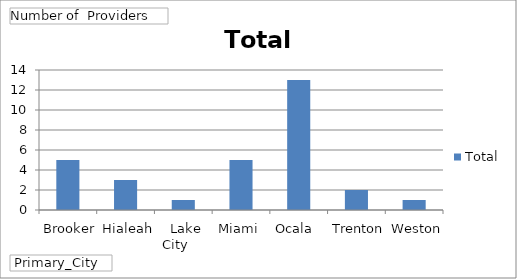
| Category | Total |
|---|---|
|  Brooker       | 5 |
|  Hialeah       | 3 |
|  Lake City     | 1 |
|  Miami         | 5 |
|  Ocala         | 13 |
|  Trenton       | 2 |
|  Weston        | 1 |